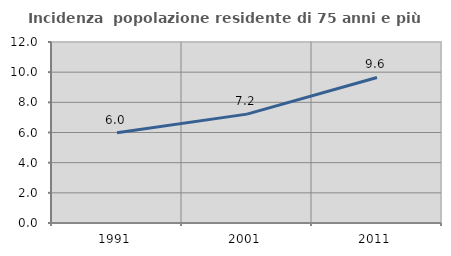
| Category | Incidenza  popolazione residente di 75 anni e più |
|---|---|
| 1991.0 | 5.99 |
| 2001.0 | 7.219 |
| 2011.0 | 9.65 |